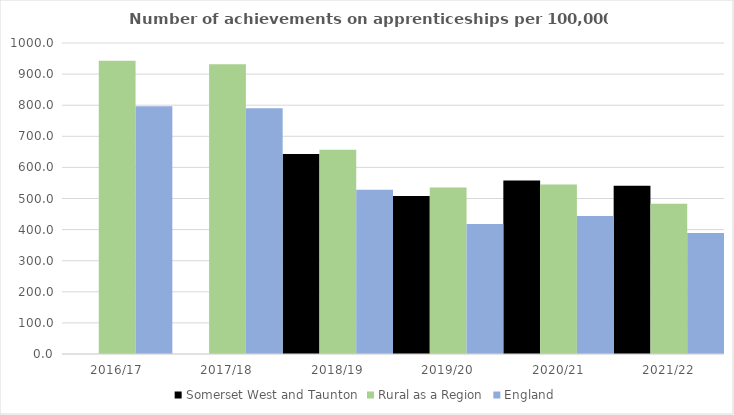
| Category | Somerset West and Taunton | Rural as a Region | England |
|---|---|---|---|
| 2016/17 | 0 | 942.594 | 797 |
| 2017/18 | 0 | 931.709 | 790 |
| 2018/19 | 643 | 656.44 | 528 |
| 2019/20 | 508 | 535.552 | 418 |
| 2020/21 | 558 | 545.333 | 444 |
| 2021/22 | 541 | 482.936 | 389 |